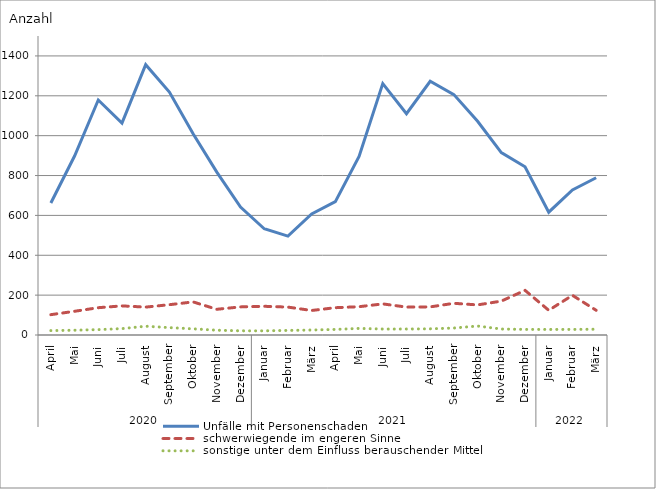
| Category | Unfälle mit Personenschaden | schwerwiegende im engeren Sinne | sonstige unter dem Einfluss berauschender Mittel |
|---|---|---|---|
| 0 | 662 | 102 | 22 |
| 1 | 898 | 119 | 24 |
| 2 | 1179 | 137 | 27 |
| 3 | 1063 | 146 | 32 |
| 4 | 1356 | 140 | 44 |
| 5 | 1219 | 152 | 37 |
| 6 | 1010 | 166 | 31 |
| 7 | 817 | 129 | 24 |
| 8 | 642 | 141 | 21 |
| 9 | 533 | 144 | 21 |
| 10 | 496 | 140 | 23 |
| 11 | 607 | 123 | 25 |
| 12 | 669 | 137 | 28 |
| 13 | 896 | 142 | 33 |
| 14 | 1261 | 156 | 30 |
| 15 | 1110 | 140 | 30 |
| 16 | 1273 | 141 | 31 |
| 17 | 1206 | 159 | 35 |
| 18 | 1072 | 151 | 45 |
| 19 | 915 | 170 | 30 |
| 20 | 844 | 224 | 28 |
| 21 | 616 | 124 | 28 |
| 22 | 728 | 199 | 28 |
| 23 | 789 | 124 | 29 |